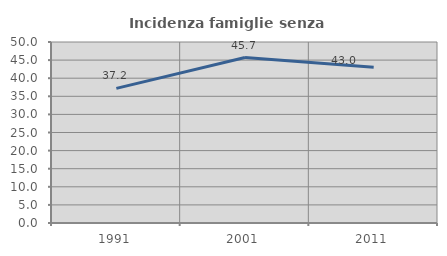
| Category | Incidenza famiglie senza nuclei |
|---|---|
| 1991.0 | 37.179 |
| 2001.0 | 45.706 |
| 2011.0 | 43.046 |